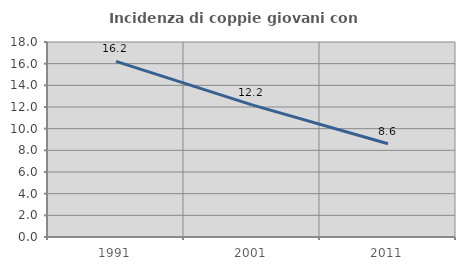
| Category | Incidenza di coppie giovani con figli |
|---|---|
| 1991.0 | 16.21 |
| 2001.0 | 12.194 |
| 2011.0 | 8.605 |